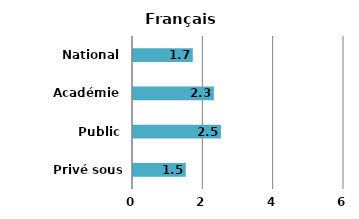
| Category | Ecart |
|---|---|
| Privé sous contrat | 1.5 |
| Public | 2.5 |
| Académie | 2.3 |
| National | 1.7 |